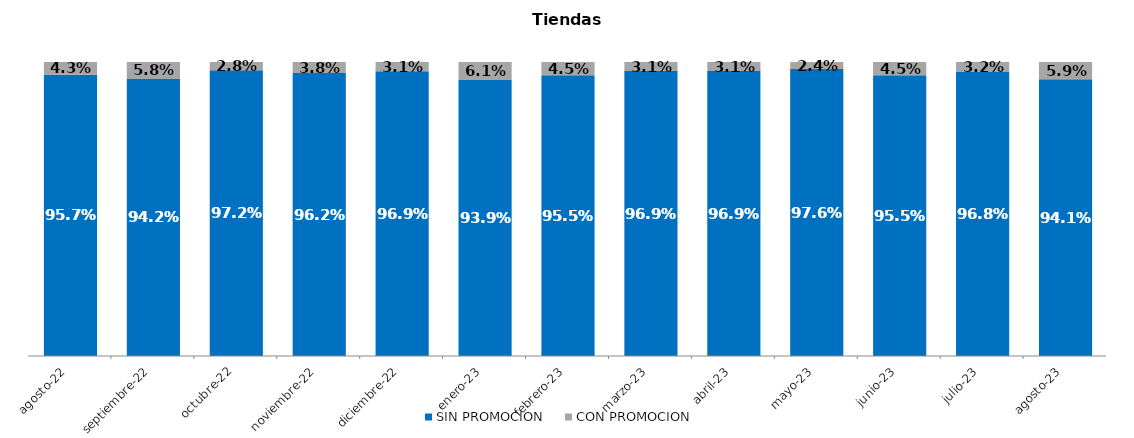
| Category | SIN PROMOCION   | CON PROMOCION   |
|---|---|---|
| 2022-08-01 | 0.957 | 0.043 |
| 2022-09-01 | 0.942 | 0.058 |
| 2022-10-01 | 0.972 | 0.028 |
| 2022-11-01 | 0.962 | 0.038 |
| 2022-12-01 | 0.969 | 0.031 |
| 2023-01-01 | 0.939 | 0.061 |
| 2023-02-01 | 0.955 | 0.045 |
| 2023-03-01 | 0.969 | 0.031 |
| 2023-04-01 | 0.969 | 0.031 |
| 2023-05-01 | 0.976 | 0.024 |
| 2023-06-01 | 0.955 | 0.045 |
| 2023-07-01 | 0.968 | 0.032 |
| 2023-08-01 | 0.941 | 0.059 |